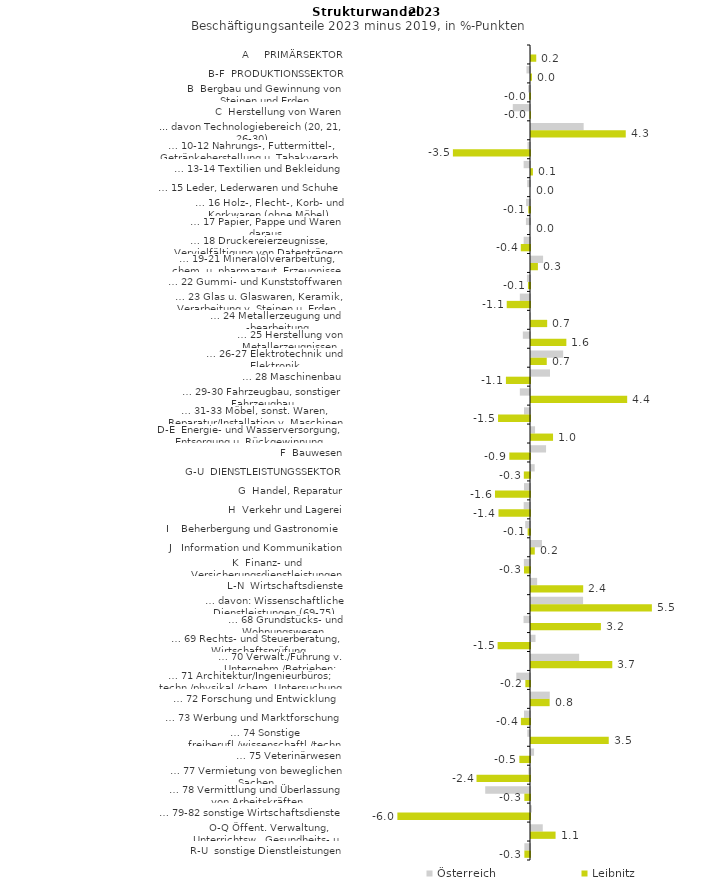
| Category | Österreich | Leibnitz |
|---|---|---|
| A     PRIMÄRSEKTOR | -0.007 | 0.238 |
| B-F  PRODUKTIONSSEKTOR | -0.161 | 0.043 |
| B  Bergbau und Gewinnung von Steinen und Erden | -0.086 | -0.038 |
| C  Herstellung von Waren | -0.782 | -0.023 |
| ... davon Technologiebereich (20, 21, 26-30) | 2.393 | 4.307 |
| … 10-12 Nahrungs-, Futtermittel-, Getränkeherstellung u. Tabakverarb. | -0.116 | -3.504 |
| … 13-14 Textilien und Bekleidung | -0.289 | 0.088 |
| … 15 Leder, Lederwaren und Schuhe | -0.13 | 0 |
| … 16 Holz-, Flecht-, Korb- und Korkwaren (ohne Möbel)  | -0.177 | -0.076 |
| … 17 Papier, Pappe und Waren daraus  | -0.185 | 0 |
| … 18 Druckereierzeugnisse, Vervielfältigung von Datenträgern | -0.288 | -0.419 |
| … 19-21 Mineralölverarbeitung, chem. u. pharmazeut. Erzeugnisse | 0.549 | 0.314 |
| … 22 Gummi- und Kunststoffwaren | -0.139 | -0.094 |
| … 23 Glas u. Glaswaren, Keramik, Verarbeitung v. Steinen u. Erden  | -0.462 | -1.058 |
| … 24 Metallerzeugung und -bearbeitung | -0.032 | 0.735 |
| … 25 Herstellung von Metallerzeugnissen  | -0.325 | 1.607 |
| … 26-27 Elektrotechnik und Elektronik | 1.462 | 0.716 |
| … 28 Maschinenbau | 0.864 | -1.095 |
| … 29-30 Fahrzeugbau, sonstiger Fahrzeugbau | -0.462 | 4.372 |
| … 31-33 Möbel, sonst. Waren, Reparatur/Installation v. Maschinen | -0.273 | -1.453 |
| D-E  Energie- und Wasserversorgung, Entsorgung u. Rückgewinnung | 0.184 | 1.002 |
| F  Bauwesen | 0.684 | -0.94 |
| G-U  DIENSTLEISTUNGSSEKTOR | 0.167 | -0.281 |
| G  Handel, Reparatur | -0.273 | -1.592 |
| H  Verkehr und Lagerei | -0.287 | -1.433 |
| I    Beherbergung und Gastronomie | -0.218 | -0.108 |
| J   Information und Kommunikation | 0.499 | 0.172 |
| K  Finanz- und Versicherungsdienstleistungen | -0.279 | -0.272 |
| L-N  Wirtschaftsdienste | 0.279 | 2.372 |
| … davon: Wissenschaftliche Dienstleistungen (69-75) | 2.367 | 5.495 |
| … 68 Grundstücks- und Wohnungswesen  | -0.294 | 3.177 |
| … 69 Rechts- und Steuerberatung, Wirtschaftsprüfung | 0.205 | -1.472 |
| … 70 Verwalt./Führung v. Unternehm./Betrieben; Unternehmensberat. | 2.188 | 3.695 |
| … 71 Architektur/Ingenieurbüros; techn./physikal./chem. Untersuchung | -0.622 | -0.211 |
| … 72 Forschung und Entwicklung  | 0.854 | 0.847 |
| … 73 Werbung und Marktforschung | -0.273 | -0.413 |
| … 74 Sonstige freiberufl./wissenschaftl./techn. Tätigkeiten | -0.124 | 3.534 |
| … 75 Veterinärwesen | 0.14 | -0.484 |
| … 77 Vermietung von beweglichen Sachen  | -0.077 | -2.431 |
| … 78 Vermittlung und Überlassung von Arbeitskräften | -2.035 | -0.256 |
| … 79-82 sonstige Wirtschaftsdienste | 0.039 | -6.029 |
| O-Q Öffent. Verwaltung, Unterrichtsw., Gesundheits- u. Sozialwesen | 0.535 | 1.116 |
| R-U  sonstige Dienstleistungen | -0.256 | -0.256 |